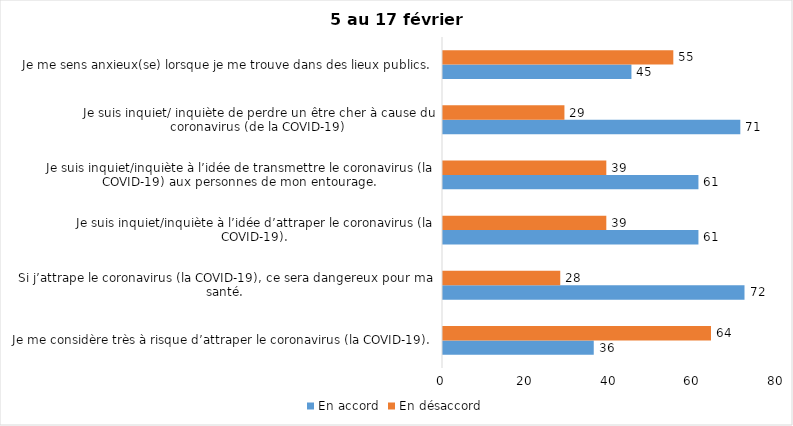
| Category | En accord | En désaccord |
|---|---|---|
| Je me considère très à risque d’attraper le coronavirus (la COVID-19). | 36 | 64 |
| Si j’attrape le coronavirus (la COVID-19), ce sera dangereux pour ma santé. | 72 | 28 |
| Je suis inquiet/inquiète à l’idée d’attraper le coronavirus (la COVID-19). | 61 | 39 |
| Je suis inquiet/inquiète à l’idée de transmettre le coronavirus (la COVID-19) aux personnes de mon entourage. | 61 | 39 |
| Je suis inquiet/ inquiète de perdre un être cher à cause du coronavirus (de la COVID-19) | 71 | 29 |
| Je me sens anxieux(se) lorsque je me trouve dans des lieux publics. | 45 | 55 |